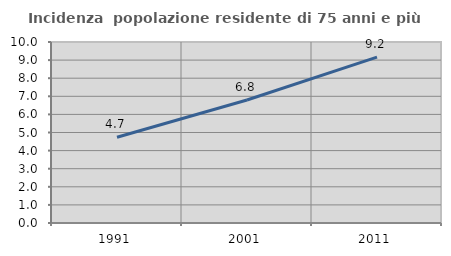
| Category | Incidenza  popolazione residente di 75 anni e più |
|---|---|
| 1991.0 | 4.735 |
| 2001.0 | 6.798 |
| 2011.0 | 9.163 |